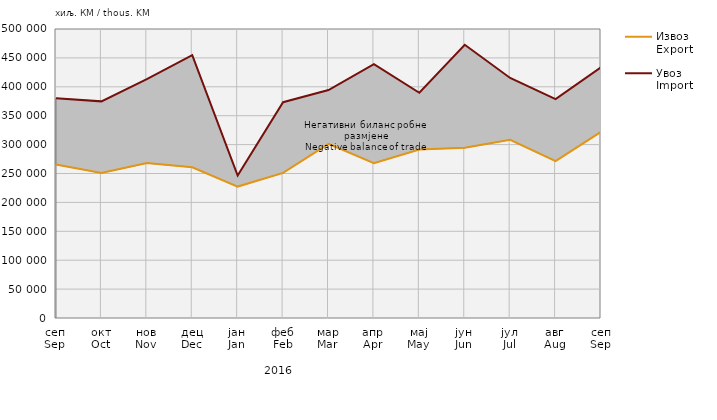
| Category | Извоз
Export | Увоз
Import |
|---|---|---|
| сеп
Sep | 265387 | 380274 |
| окт
Oct | 250954 | 374802 |
| нов
Nov | 267945 | 413271 |
| дец
Dec | 260835 | 454746 |
| јан
Jan | 227374 | 246360 |
| феб
Feb | 250969 | 373425 |
| мар
Mar | 301409 | 394461 |
| апр
Apr | 267973 | 439274 |
| мај
May | 291497 | 389725 |
| јун
Jun | 294512 | 472809 |
| јул
Jul | 308275 | 415285 |
| авг
Aug | 271563 | 378754 |
| сеп
Sep | 322118 | 433782 |